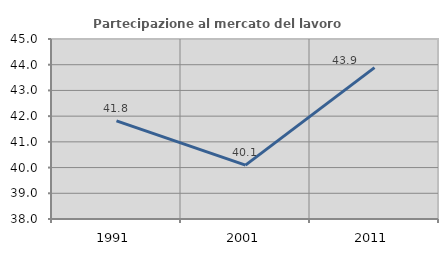
| Category | Partecipazione al mercato del lavoro  femminile |
|---|---|
| 1991.0 | 41.817 |
| 2001.0 | 40.096 |
| 2011.0 | 43.887 |